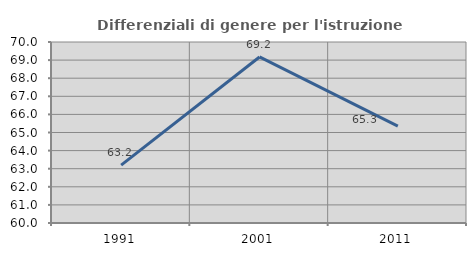
| Category | Differenziali di genere per l'istruzione superiore |
|---|---|
| 1991.0 | 63.2 |
| 2001.0 | 69.174 |
| 2011.0 | 65.349 |